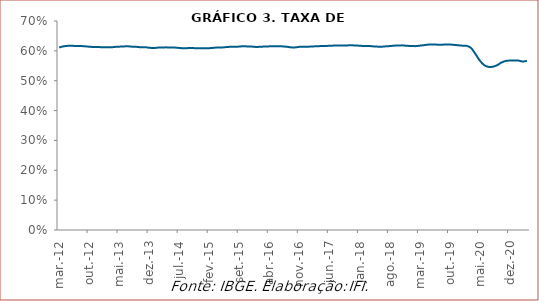
| Category | Taxa de participação |
|---|---|
| 2012-03-01 | 0.611 |
| 2012-04-01 | 0.615 |
| 2012-05-01 | 0.617 |
| 2012-06-01 | 0.617 |
| 2012-07-01 | 0.616 |
| 2012-08-01 | 0.616 |
| 2012-09-01 | 0.615 |
| 2012-10-01 | 0.614 |
| 2012-11-01 | 0.613 |
| 2012-12-01 | 0.613 |
| 2013-01-01 | 0.612 |
| 2013-02-01 | 0.612 |
| 2013-03-01 | 0.612 |
| 2013-04-01 | 0.613 |
| 2013-05-01 | 0.614 |
| 2013-06-01 | 0.615 |
| 2013-07-01 | 0.615 |
| 2013-08-01 | 0.614 |
| 2013-09-01 | 0.613 |
| 2013-10-01 | 0.612 |
| 2013-11-01 | 0.612 |
| 2013-12-01 | 0.61 |
| 2014-01-01 | 0.609 |
| 2014-02-01 | 0.611 |
| 2014-03-01 | 0.611 |
| 2014-04-01 | 0.612 |
| 2014-05-01 | 0.611 |
| 2014-06-01 | 0.611 |
| 2014-07-01 | 0.61 |
| 2014-08-01 | 0.609 |
| 2014-09-01 | 0.609 |
| 2014-10-01 | 0.609 |
| 2014-11-01 | 0.609 |
| 2014-12-01 | 0.609 |
| 2015-01-01 | 0.608 |
| 2015-02-01 | 0.609 |
| 2015-03-01 | 0.61 |
| 2015-04-01 | 0.612 |
| 2015-05-01 | 0.611 |
| 2015-06-01 | 0.613 |
| 2015-07-01 | 0.614 |
| 2015-08-01 | 0.614 |
| 2015-09-01 | 0.614 |
| 2015-10-01 | 0.616 |
| 2015-11-01 | 0.614 |
| 2015-12-01 | 0.614 |
| 2016-01-01 | 0.613 |
| 2016-02-01 | 0.614 |
| 2016-03-01 | 0.614 |
| 2016-04-01 | 0.615 |
| 2016-05-01 | 0.616 |
| 2016-06-01 | 0.616 |
| 2016-07-01 | 0.615 |
| 2016-08-01 | 0.614 |
| 2016-09-01 | 0.612 |
| 2016-10-01 | 0.612 |
| 2016-11-01 | 0.613 |
| 2016-12-01 | 0.614 |
| 2017-01-01 | 0.614 |
| 2017-02-01 | 0.615 |
| 2017-03-01 | 0.616 |
| 2017-04-01 | 0.616 |
| 2017-05-01 | 0.616 |
| 2017-06-01 | 0.617 |
| 2017-07-01 | 0.618 |
| 2017-08-01 | 0.618 |
| 2017-09-01 | 0.618 |
| 2017-10-01 | 0.618 |
| 2017-11-01 | 0.619 |
| 2017-12-01 | 0.618 |
| 2018-01-01 | 0.617 |
| 2018-02-01 | 0.616 |
| 2018-03-01 | 0.617 |
| 2018-04-01 | 0.615 |
| 2018-05-01 | 0.614 |
| 2018-06-01 | 0.614 |
| 2018-07-01 | 0.615 |
| 2018-08-01 | 0.616 |
| 2018-09-01 | 0.617 |
| 2018-10-01 | 0.618 |
| 2018-11-01 | 0.618 |
| 2018-12-01 | 0.617 |
| 2019-01-01 | 0.616 |
| 2019-02-01 | 0.616 |
| 2019-03-01 | 0.617 |
| 2019-04-01 | 0.619 |
| 2019-05-01 | 0.621 |
| 2019-06-01 | 0.621 |
| 2019-07-01 | 0.621 |
| 2019-08-01 | 0.621 |
| 2019-09-01 | 0.621 |
| 2019-10-01 | 0.621 |
| 2019-11-01 | 0.62 |
| 2019-12-01 | 0.619 |
| 2020-01-01 | 0.617 |
| 2020-02-01 | 0.617 |
| 2020-03-01 | 0.61 |
| 2020-04-01 | 0.59 |
| 2020-05-01 | 0.568 |
| 2020-06-01 | 0.553 |
| 2020-07-01 | 0.547 |
| 2020-08-01 | 0.547 |
| 2020-09-01 | 0.551 |
| 2020-10-01 | 0.56 |
| 2020-11-01 | 0.566 |
| 2020-12-01 | 0.568 |
| 2021-01-01 | 0.568 |
| 2021-02-01 | 0.568 |
| 2021-03-01 | 0.564 |
| 2021-04-01 | 0.567 |